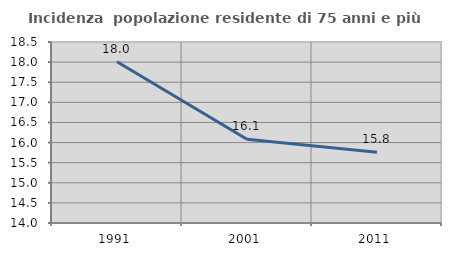
| Category | Incidenza  popolazione residente di 75 anni e più |
|---|---|
| 1991.0 | 18.009 |
| 2001.0 | 16.08 |
| 2011.0 | 15.761 |